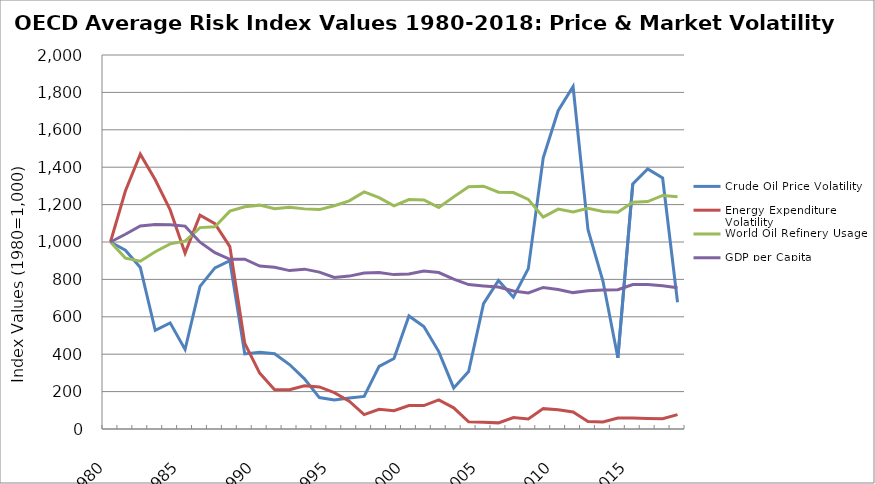
| Category | Crude Oil Price Volatility | Energy Expenditure Volatility | World Oil Refinery Usage | GDP per Capita |
|---|---|---|---|---|
| 1980.0 | 1000 | 1000 | 1000 | 1000 |
| 1981.0 | 955.85 | 1272.894 | 913.766 | 1041.402 |
| 1982.0 | 863.929 | 1469.568 | 897.291 | 1085.74 |
| 1983.0 | 527.37 | 1332.911 | 947.696 | 1093.194 |
| 1984.0 | 567.506 | 1171.535 | 990.285 | 1092.211 |
| 1985.0 | 425.164 | 940.277 | 1004.663 | 1084.864 |
| 1986.0 | 762.993 | 1143.395 | 1077.014 | 999.172 |
| 1987.0 | 861.435 | 1098.343 | 1081.581 | 943.267 |
| 1988.0 | 899.987 | 975.487 | 1164.775 | 907.264 |
| 1989.0 | 401.474 | 457.886 | 1188.813 | 907.76 |
| 1990.0 | 409.977 | 298.965 | 1197.108 | 871.652 |
| 1991.0 | 402.244 | 210.449 | 1177.498 | 864.675 |
| 1992.0 | 344.712 | 210.488 | 1186.321 | 847.094 |
| 1993.0 | 268.314 | 231.605 | 1177.146 | 854.849 |
| 1994.0 | 168.033 | 224.818 | 1173.181 | 839.065 |
| 1995.0 | 155.369 | 194.721 | 1193.732 | 810.573 |
| 1996.0 | 166.095 | 149.113 | 1219.773 | 817.567 |
| 1997.0 | 174.239 | 77.254 | 1268.09 | 834.002 |
| 1998.0 | 334.964 | 105.075 | 1237.273 | 837.176 |
| 1999.0 | 376.757 | 97.377 | 1193.286 | 825.57 |
| 2000.0 | 604.705 | 125.312 | 1227.095 | 828.957 |
| 2001.0 | 548.028 | 125.213 | 1224.451 | 844.934 |
| 2002.0 | 413.987 | 155.515 | 1185.054 | 836.675 |
| 2003.0 | 219.592 | 113.121 | 1241.275 | 800.942 |
| 2004.0 | 307.323 | 38.051 | 1295.272 | 772.198 |
| 2005.0 | 670.784 | 36.33 | 1298.641 | 765.328 |
| 2006.0 | 794.183 | 32.805 | 1266.356 | 759.203 |
| 2007.0 | 704.903 | 61.409 | 1264.512 | 738.429 |
| 2008.0 | 857.726 | 53.439 | 1228.01 | 727.264 |
| 2009.0 | 1450.248 | 108.914 | 1132.952 | 757.046 |
| 2010.0 | 1702.214 | 103.199 | 1175.971 | 746.354 |
| 2011.0 | 1831.152 | 90.616 | 1160.849 | 729.359 |
| 2012.0 | 1065.343 | 40.244 | 1180.804 | 739.116 |
| 2013.0 | 791.377 | 37.967 | 1162.733 | 743.12 |
| 2014.0 | 380.873 | 58.325 | 1159.401 | 744.789 |
| 2015.0 | 1310.165 | 58.161 | 1212.465 | 772.85 |
| 2016.0 | 1390.673 | 55.713 | 1216.058 | 772.188 |
| 2017.0 | 1342.238 | 54.847 | 1248.994 | 765.862 |
| 2018.0 | 677.705 | 76.984 | 1242.193 | 755.631 |